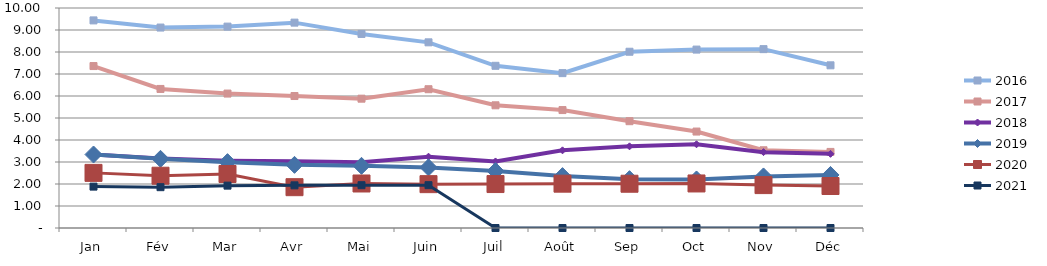
| Category | 2015 | 2016 | 2017 | 2018 | 2019 | 2020 | 2021 |
|---|---|---|---|---|---|---|---|
| Jan |  | 9.436 | 7.361 | 3.34 | 3.341 | 2.506 | 1.881 |
| Fév |  | 9.111 | 6.321 | 3.159 | 3.145 | 2.376 | 1.856 |
| Mar |  | 9.154 | 6.111 | 3.062 | 2.994 | 2.455 | 1.926 |
| Avr |  | 9.335 | 5.999 | 3.031 | 2.87 | 1.855 | 1.939 |
| Mai |  | 8.821 | 5.878 | 2.984 | 2.827 | 2.023 | 1.946 |
| Juin |  | 8.439 | 6.309 | 3.242 | 2.755 | 1.993 | 1.947 |
| Juil |  | 7.373 | 5.577 | 3.025 | 2.589 | 1.998 | 0 |
| Août |  | 7.04 | 5.36 | 3.53 | 2.359 | 2.015 | 0 |
| Sep |  | 8.012 | 4.855 | 3.712 | 2.22 | 2.012 | 0 |
| Oct |  | 8.109 | 4.384 | 3.806 | 2.206 | 2.024 | 0 |
| Nov |  | 8.13 | 3.533 | 3.449 | 2.343 | 1.95 | 0 |
| Déc |  | 7.395 | 3.458 | 3.371 | 2.411 | 1.909 | 0 |